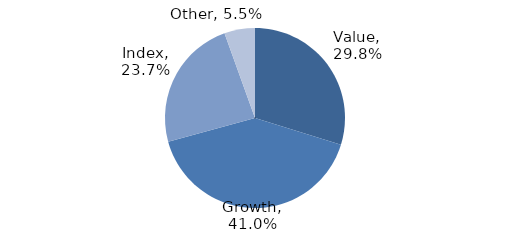
| Category | Investment Style |
|---|---|
| Value | 0.298 |
| Growth | 0.41 |
| Index | 0.237 |
| Other | 0.055 |